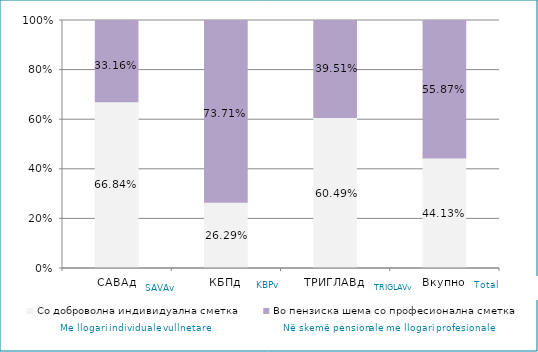
| Category | Со доброволна индивидуална сметка  | Во пензиска шема со професионална сметка |
|---|---|---|
| САВАд | 0.668 | 0.332 |
| КБПд | 0.263 | 0.737 |
| ТРИГЛАВд | 0.605 | 0.395 |
| Вкупно | 0.441 | 0.559 |